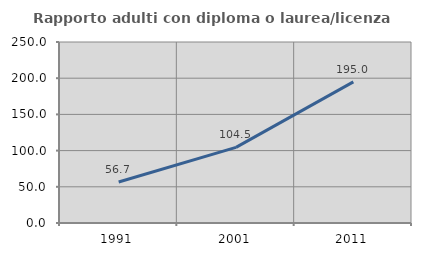
| Category | Rapporto adulti con diploma o laurea/licenza media  |
|---|---|
| 1991.0 | 56.674 |
| 2001.0 | 104.485 |
| 2011.0 | 195 |